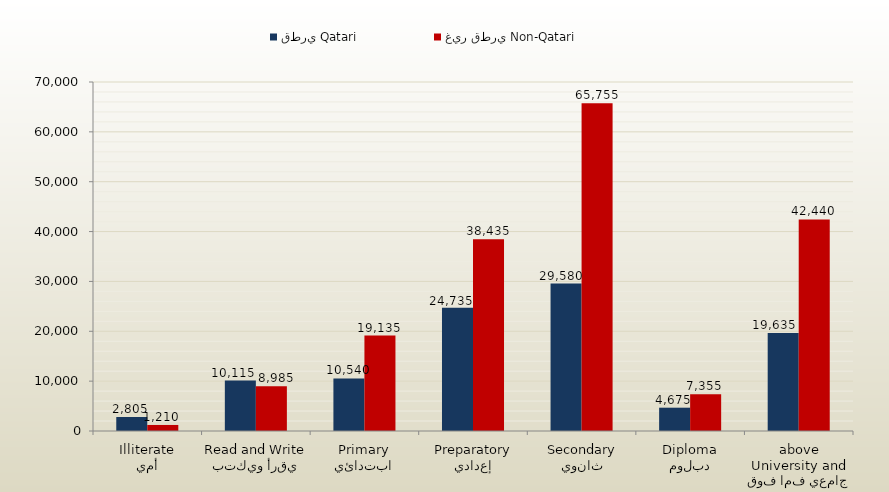
| Category | قطري Qatari | غير قطري Non-Qatari |
|---|---|---|
| أمي
Illiterate | 2805 | 1210 |
| يقرأ ويكتب
Read and Write | 10115 | 8985 |
| ابتدائي
Primary | 10540 | 19135 |
| إعدادي
Preparatory | 24735 | 38435 |
| ثانوي
Secondary | 29580 | 65755 |
| دبلوم
Diploma | 4675 | 7355 |
| جامعي فما فوق
University and above | 19635 | 42440 |